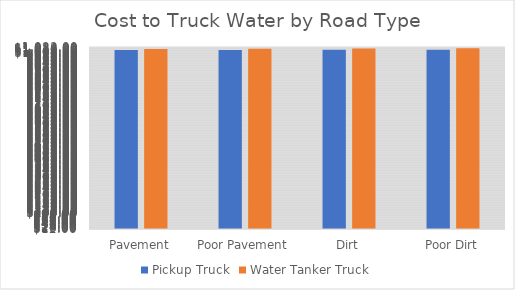
| Category | Pickup Truck | Water Tanker Truck |
|---|---|---|
| Pavement | 1015.234 | 1021.386 |
| Poor Pavement | 1015.786 | 1022.307 |
| Dirt | 1016.344 | 1023.246 |
| Poor Dirt | 1016.954 | 1024.323 |